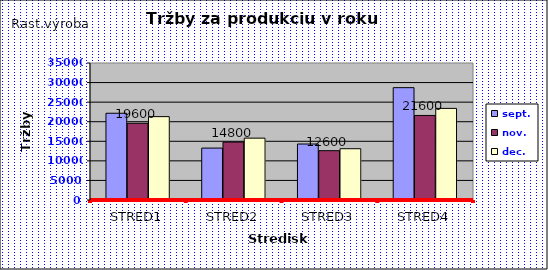
| Category | sept. | nov. | dec. |
|---|---|---|---|
| STRED1 | 22160 | 19600 | 21300 |
| STRED2 | 13262 | 14800 | 15800 |
| STRED3 | 14300 | 12600 | 13100 |
| STRED4 | 28700 | 21600 | 23400 |